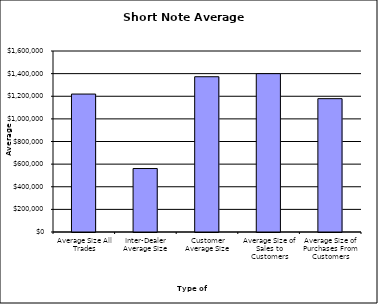
| Category | Security Type |
|---|---|
| Average Size All Trades | 1219459.252 |
| Inter-Dealer Average Size | 561096.939 |
| Customer Average Size | 1372530.442 |
| Average Size of Sales to Customers | 1399814.835 |
| Average Size of Purchases From Customers | 1178653.846 |